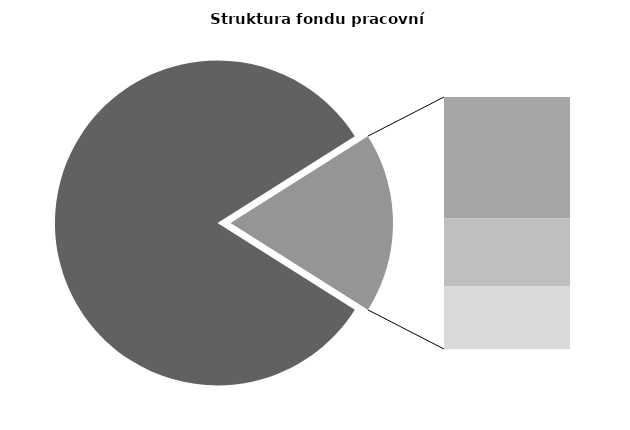
| Category | Series 0 |
|---|---|
| Průměrná měsíční odpracovaná doba bez přesčasu | 138.808 |
| Dovolená | 14.607 |
| Nemoc | 8.148 |
| Jiné | 7.603 |